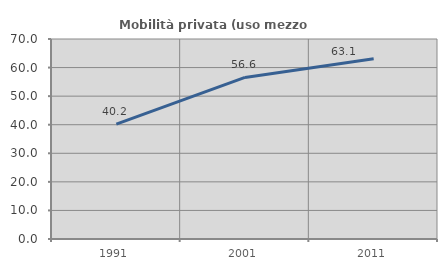
| Category | Mobilità privata (uso mezzo privato) |
|---|---|
| 1991.0 | 40.21 |
| 2001.0 | 56.561 |
| 2011.0 | 63.071 |